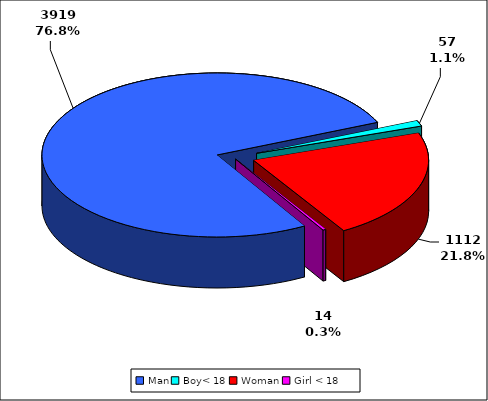
| Category | TOTAL |
|---|---|
| Man | 3919 |
| Boy< 18 | 57 |
| Woman | 1112 |
| Girl < 18 | 14 |